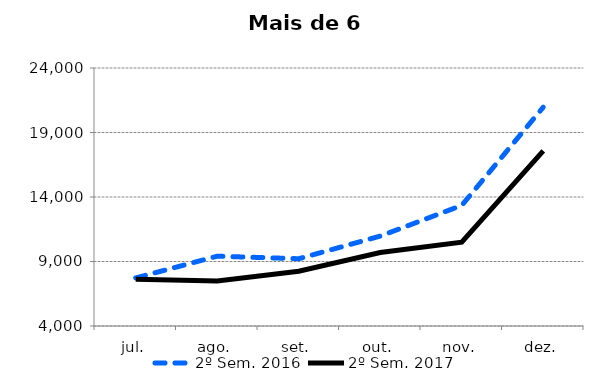
| Category | 2º Sem. 2016 | 2º Sem. 2017 |
|---|---|---|
| jul. | 7726 | 7625 |
| ago. | 9412 | 7482 |
| set. | 9215 | 8248 |
| out. | 10970 | 9697 |
| nov. | 13349 | 10497 |
| dez. | 20961 | 17581 |